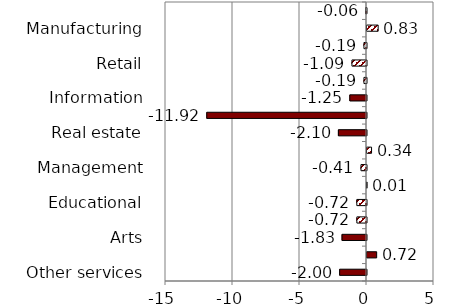
| Category | Series 0 |
|---|---|
| Other services | -2.004 |
| Accommodation | 0.722 |
| Arts | -1.825 |
| Health care | -0.72 |
| Educational | -0.724 |
| Administrative | 0.008 |
| Management | -0.412 |
| Professional | 0.34 |
| Real estate | -2.097 |
| Finance | -11.92 |
| Information | -1.245 |
| Transportation | -0.191 |
| Retail | -1.086 |
| Wholesale | -0.191 |
| Manufacturing | 0.833 |
| Util., construction | -0.059 |